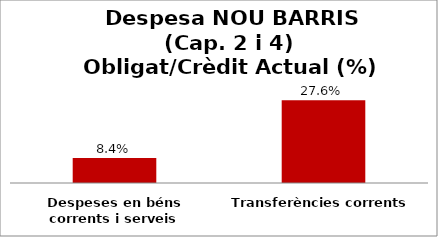
| Category | Series 0 |
|---|---|
| Despeses en béns corrents i serveis | 0.084 |
| Transferències corrents | 0.276 |